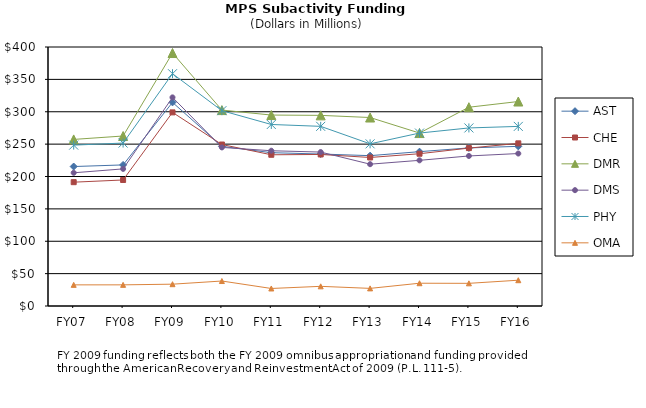
| Category | AST | CHE | DMR | DMS | PHY | OMA |
|---|---|---|---|---|---|---|
| FY07 | 215.391 | 191.22 | 257.27 | 205.74 | 248.47 | 32.64 |
| FY08 | 217.901 | 194.623 | 262.547 | 211.752 | 251.639 | 32.671 |
| FY09 | 314.473 | 299.029 | 390.694 | 322.181 | 358.771 | 33.702 |
| FY10 | 246.53 | 249.383 | 302.575 | 244.919 | 301.66 | 38.584 |
| FY11 | 236.784 | 233.548 | 294.906 | 239.786 | 280.338 | 27.061 |
| FY12 | 234.724 | 234.028 | 294.404 | 237.722 | 277.444 | 30.374 |
| FY13 | 232.17 | 229.39 | 291.09 | 219.02 | 250.45 | 27.22 |
| FY14 | 238.36 | 235.18 | 267.09 | 224.97 | 267.09 | 35.17 |
| FY15 | 244.16 | 243.85 | 306.99 | 231.73 | 274.99 | 35 |
| FY16 | 246.55 | 251.2 | 315.8 | 235.47 | 277.37 | 39.84 |